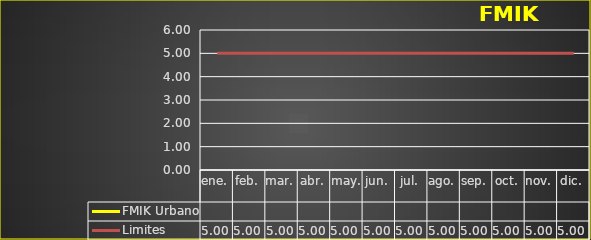
| Category | FMIK Urbano | Limites |
|---|---|---|
| ene. |  | 5 |
| feb. |  | 5 |
| mar. |  | 5 |
| abr. |  | 5 |
| may. |  | 5 |
| jun. |  | 5 |
| jul. |  | 5 |
| ago. |  | 5 |
| sep. |  | 5 |
| oct. |  | 5 |
| nov. |  | 5 |
| dic. |  | 5 |